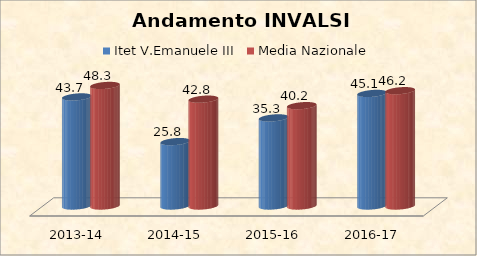
| Category | Itet V.Emanuele III | Media Nazionale |
|---|---|---|
| 2013-14 | 43.7 | 48.3 |
| 2014-15 | 25.8 | 42.8 |
| 2015-16 | 35.3 | 40.2 |
| 2016-17 | 45.1 | 46.2 |